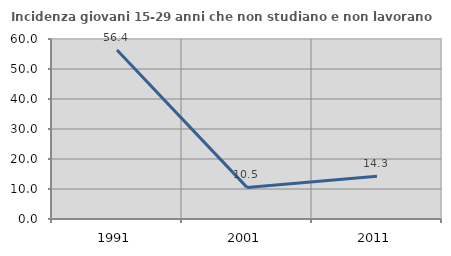
| Category | Incidenza giovani 15-29 anni che non studiano e non lavorano  |
|---|---|
| 1991.0 | 56.363 |
| 2001.0 | 10.536 |
| 2011.0 | 14.254 |